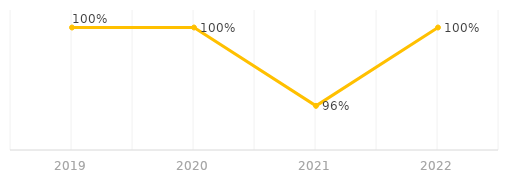
| Category | Porcentaje de unidades de transporte público con refrigeración |
|---|---|
| 2019.0 | 1 |
| 2020.0 | 1 |
| 2021.0 | 0.955 |
| 2022.0 | 1 |